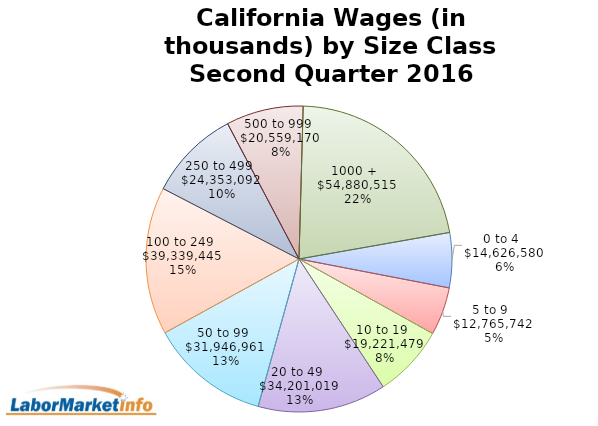
| Category | Series 0 |
|---|---|
| 0 to 4   | 14626579.743 |
| 5 to 9   | 12765741.959 |
| 10 to 19   | 19221478.558 |
| 20 to 49   | 34201018.694 |
| 50 to 99   | 31946961.315 |
| 100 to 249   | 39339444.672 |
| 250 to 499   | 24353092.481 |
| 500 to 999   | 20559170.155 |
| 1000 +   | 54880515.469 |